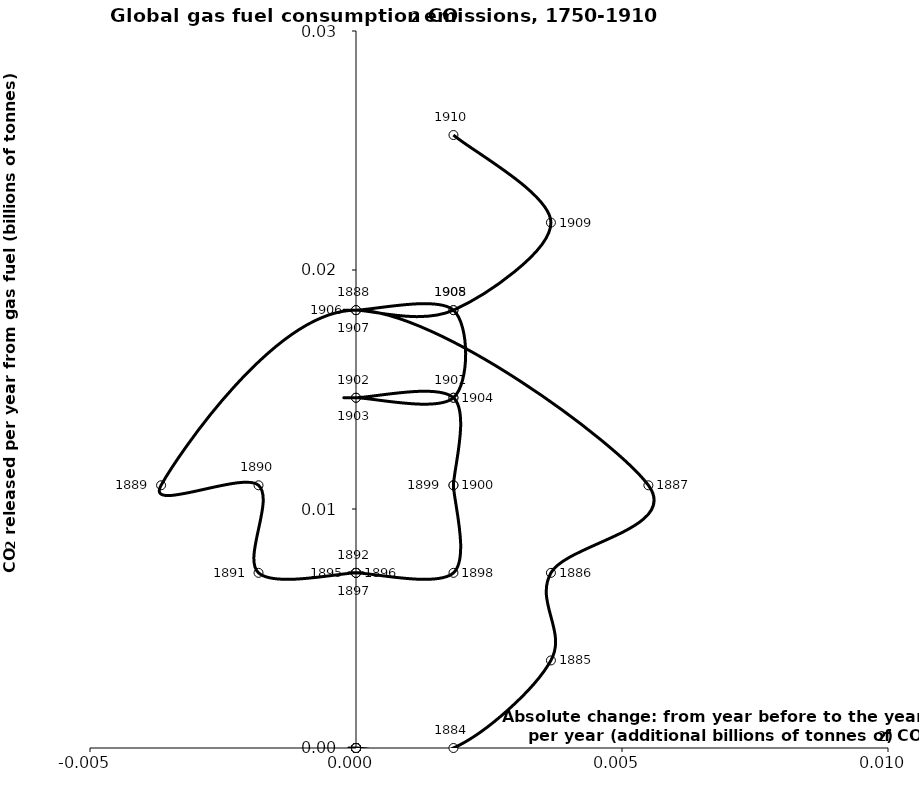
| Category | Series 0 |
|---|---|
| 0.0 | 0 |
| 0.0 | 0 |
| 0.0 | 0 |
| 0.0 | 0 |
| 0.0 | 0 |
| 0.0 | 0 |
| 0.0 | 0 |
| 0.0 | 0 |
| 0.0 | 0 |
| 0.0 | 0 |
| 0.0 | 0 |
| 0.0 | 0 |
| 0.0 | 0 |
| 0.0 | 0 |
| 0.0 | 0 |
| 0.0 | 0 |
| 0.0 | 0 |
| 0.001832 | 0 |
| 0.003664 | 0.004 |
| 0.0036639999999999997 | 0.007 |
| 0.005495999999999999 | 0.011 |
| 0.0 | 0.018 |
| -0.0036639999999999997 | 0.011 |
| -0.0018319999999999999 | 0.011 |
| -0.0018319999999999999 | 0.007 |
| 0.0 | 0.007 |
| 0.0 | 0.007 |
| 0.0 | 0.007 |
| 0.0 | 0.007 |
| 0.0 | 0.007 |
| 0.0 | 0.007 |
| 0.0018319999999999999 | 0.007 |
| 0.0018319999999999999 | 0.011 |
| 0.0018320000000000003 | 0.011 |
| 0.0018320000000000003 | 0.015 |
| 0.0 | 0.015 |
| 0.0 | 0.015 |
| 0.0018319999999999994 | 0.015 |
| 0.0018319999999999994 | 0.018 |
| 0.0 | 0.018 |
| 0.0 | 0.018 |
| 0.0018320000000000003 | 0.018 |
| 0.0036640000000000006 | 0.022 |
| 0.0018320000000000003 | 0.026 |